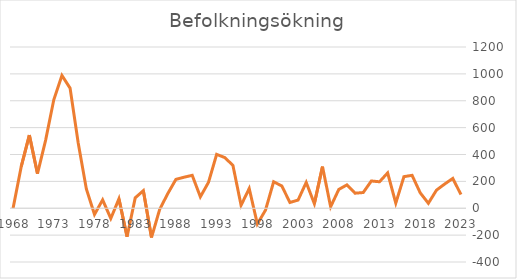
| Category | Series 0 |
|---|---|
| 2023.0 | 102 |
| 2022.0 | 222 |
| 2021.0 | 180 |
| 2020.0 | 135 |
| 2019.0 | 37 |
| 2018.0 | 115 |
| 2017.0 | 245 |
| 2016.0 | 235 |
| 2015.0 | 38 |
| 2014.0 | 263 |
| 2013.0 | 197 |
| 2012.0 | 203 |
| 2011.0 | 117 |
| 2010.0 | 112 |
| 2009.0 | 174 |
| 2008.0 | 140 |
| 2007.0 | 11 |
| 2006.0 | 310 |
| 2005.0 | 34 |
| 2004.0 | 192 |
| 2003.0 | 61 |
| 2002.0 | 43 |
| 2001.0 | 166 |
| 2000.0 | 197 |
| 1999.0 | -14 |
| 1998.0 | -117 |
| 1997.0 | 147 |
| 1996.0 | 22 |
| 1995.0 | 319 |
| 1994.0 | 377 |
| 1993.0 | 401 |
| 1992.0 | 193 |
| 1991.0 | 85 |
| 1990.0 | 245 |
| 1989.0 | 231 |
| 1988.0 | 215 |
| 1987.0 | 109 |
| 1986.0 | -9 |
| 1985.0 | -218 |
| 1984.0 | 131 |
| 1983.0 | 77 |
| 1982.0 | -212 |
| 1981.0 | 70 |
| 1980.0 | -76 |
| 1979.0 | 63 |
| 1978.0 | -47 |
| 1977.0 | 144 |
| 1976.0 | 485 |
| 1975.0 | 894 |
| 1974.0 | 988 |
| 1973.0 | 807 |
| 1972.0 | 507 |
| 1971.0 | 257 |
| 1970.0 | 544 |
| 1969.0 | 310 |
| 1968.0 | 0 |